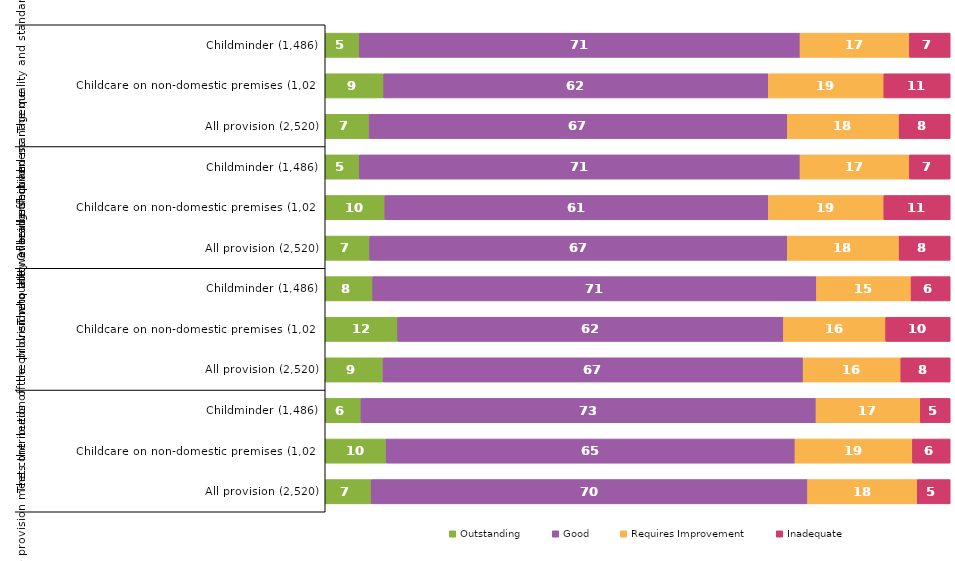
| Category | Outstanding | Good | Requires Improvement | Inadequate |
|---|---|---|---|---|
| 0 | 5.451 | 70.525 | 17.497 | 6.528 |
| 1 | 9.348 | 61.538 | 18.5 | 10.613 |
| 2 | 7.024 | 66.905 | 17.897 | 8.175 |
| 3 | 5.451 | 70.525 | 17.497 | 6.528 |
| 4 | 9.542 | 61.344 | 18.5 | 10.613 |
| 5 | 7.103 | 66.825 | 17.897 | 8.175 |
| 6 | 7.604 | 70.996 | 15.141 | 6.258 |
| 7 | 11.587 | 61.733 | 16.358 | 10.321 |
| 8 | 9.246 | 67.222 | 15.635 | 7.897 |
| 9 | 5.72 | 72.813 | 16.689 | 4.778 |
| 10 | 9.737 | 65.433 | 18.793 | 6.037 |
| 11 | 7.341 | 69.841 | 17.54 | 5.278 |